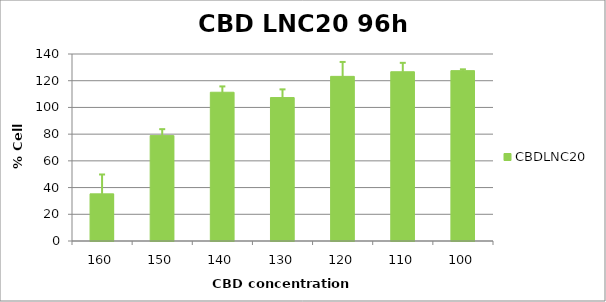
| Category | CBDLNC20 |
|---|---|
| 160.0 | 35.283 |
| 150.0 | 78.903 |
| 140.0 | 111.37 |
| 130.0 | 107.393 |
| 120.0 | 123.259 |
| 110.0 | 126.711 |
| 100.0 | 127.546 |